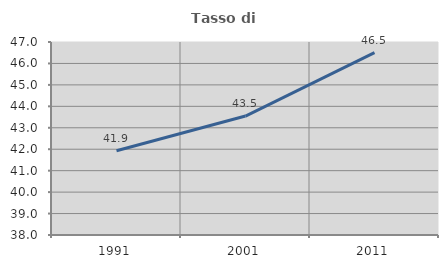
| Category | Tasso di occupazione   |
|---|---|
| 1991.0 | 41.928 |
| 2001.0 | 43.547 |
| 2011.0 | 46.501 |